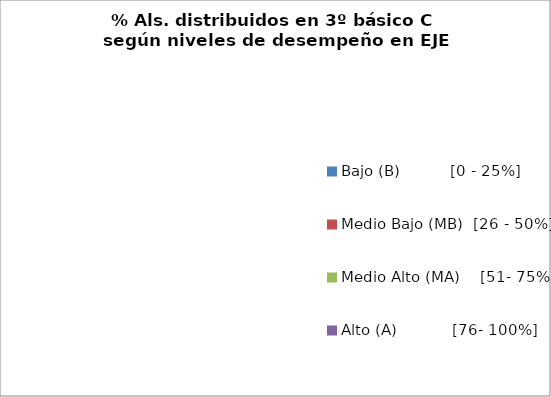
| Category | Series 0 |
|---|---|
| Bajo (B)          [0 - 25%] | 0 |
| Medio Bajo (MB)  [26 - 50%] | 0 |
| Medio Alto (MA)    [51- 75%] | 0 |
| Alto (A)           [76- 100%] | 0 |